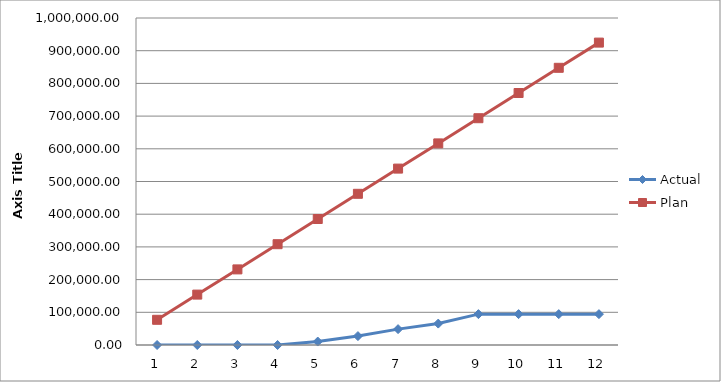
| Category | Actual | Plan |
|---|---|---|
| 0 | 0 | 77062.5 |
| 1 | 0 | 154125 |
| 2 | 0 | 231187.5 |
| 3 | 0 | 308250 |
| 4 | 10560.19 | 385312.5 |
| 5 | 27217.15 | 462375 |
| 6 | 48527.09 | 539437.5 |
| 7 | 65498.93 | 616500 |
| 8 | 94390.25 | 693562.5 |
| 9 | 94390.25 | 770625 |
| 10 | 94390.25 | 847687.5 |
| 11 | 94390.25 | 924750 |